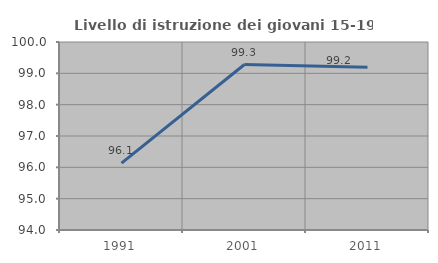
| Category | Livello di istruzione dei giovani 15-19 anni |
|---|---|
| 1991.0 | 96.135 |
| 2001.0 | 99.281 |
| 2011.0 | 99.194 |